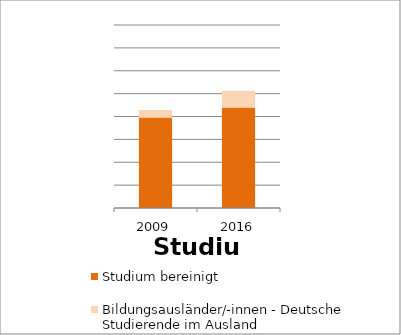
| Category | Studium bereinigt | Bildungsausländer/-innen - Deutsche Studierende im Ausland |
|---|---|---|
| 2009.0 | 395966 | 32034 |
| 2016.0 | 438861.372 | 73784.628 |